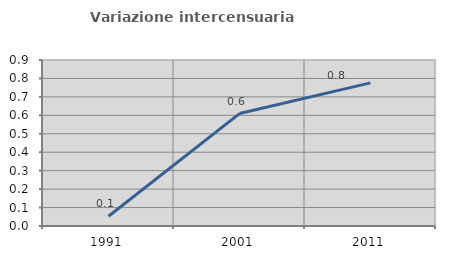
| Category | Variazione intercensuaria annua |
|---|---|
| 1991.0 | 0.053 |
| 2001.0 | 0.61 |
| 2011.0 | 0.776 |